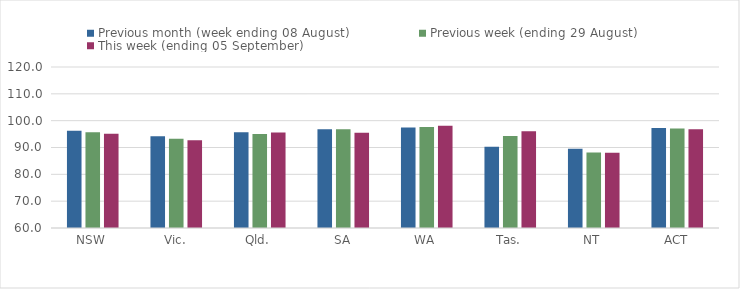
| Category | Previous month (week ending 08 August) | Previous week (ending 29 August) | This week (ending 05 September) |
|---|---|---|---|
| NSW | 96.21 | 95.67 | 95.16 |
| Vic. | 94.17 | 93.29 | 92.7 |
| Qld. | 95.69 | 95.01 | 95.62 |
| SA | 96.78 | 96.78 | 95.53 |
| WA | 97.42 | 97.62 | 98.1 |
| Tas. | 90.31 | 94.33 | 96.07 |
| NT | 89.55 | 88.17 | 88.06 |
| ACT | 97.24 | 97.12 | 96.78 |